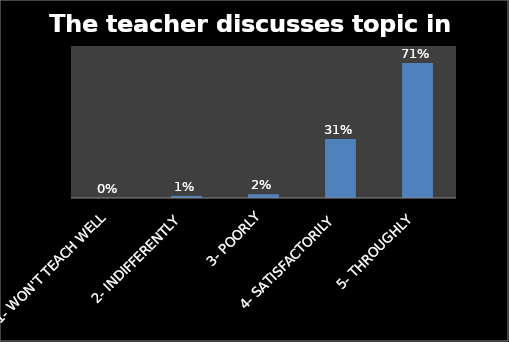
| Category | Series 0 |
|---|---|
| 1- WON'T TEACH WELL | 0 |
| 2- INDIFFERENTLY | 0.011 |
| 3- POORLY | 0.02 |
| 4- SATISFACTORILY | 0.31 |
| 5- THROUGHLY | 0.71 |